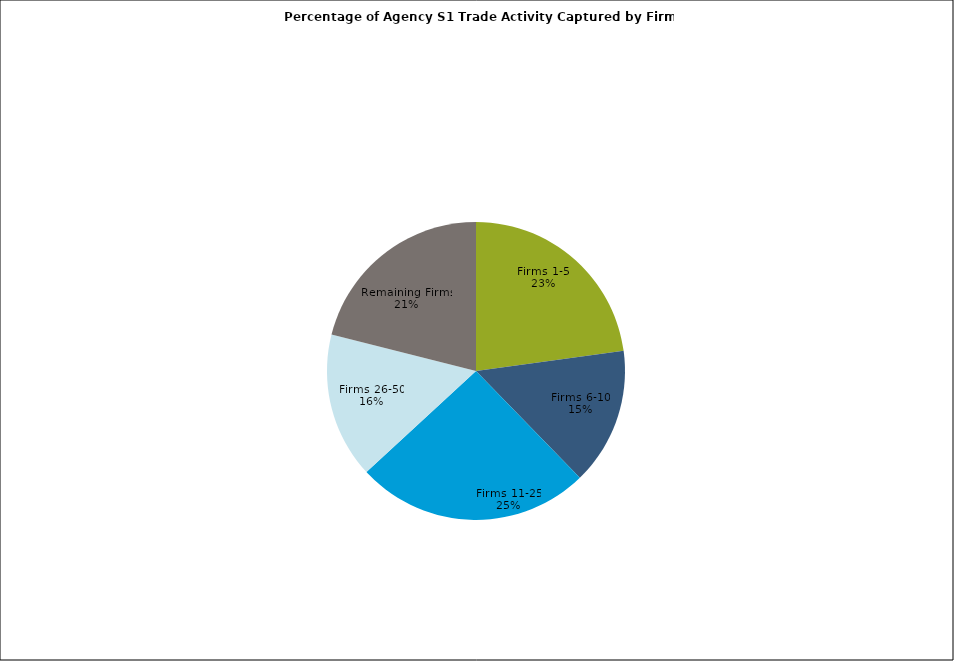
| Category | Series 0 |
|---|---|
| Firms 1-5 | 0.228 |
| Firms 6-10 | 0.149 |
| Firms 11-25 | 0.254 |
| Firms 26-50 | 0.158 |
| Remaining Firms | 0.211 |